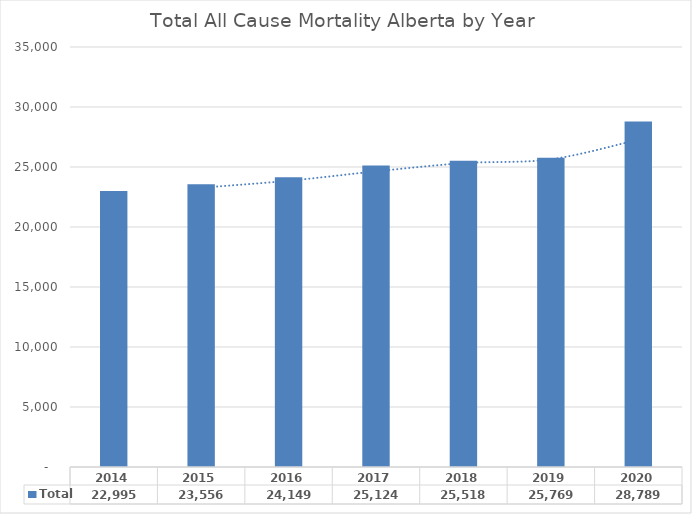
| Category | Total |
|---|---|
| 2014.0 | 22995 |
| 2015.0 | 23556 |
| 2016.0 | 24149 |
| 2017.0 | 25124 |
| 2018.0 | 25518 |
| 2019.0 | 25769 |
| 2020.0 | 28789 |